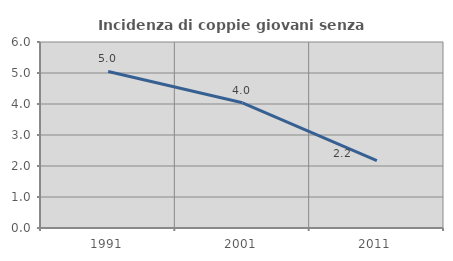
| Category | Incidenza di coppie giovani senza figli |
|---|---|
| 1991.0 | 5.05 |
| 2001.0 | 4.038 |
| 2011.0 | 2.177 |